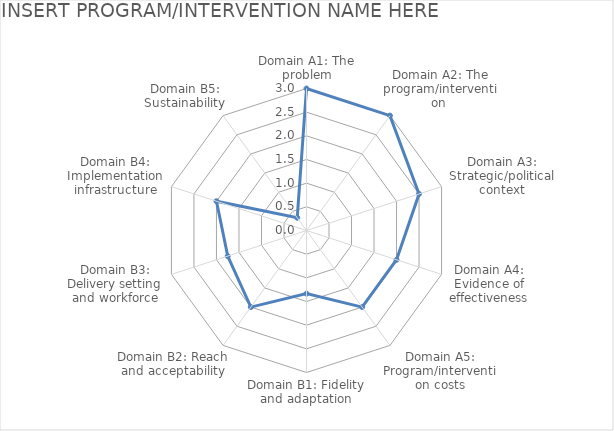
| Category | Score |
|---|---|
| Domain A1: The problem | 3 |
| Domain A2: The program/intervention  | 3 |
| Domain A3: Strategic/political context | 2.5 |
| Domain A4: Evidence of effectiveness | 2 |
| Domain A5: Program/intervention costs | 2 |
| Domain B1: Fidelity and adaptation | 1.333 |
| Domain B2: Reach and acceptability | 2 |
| Domain B3: Delivery setting and workforce | 1.75 |
| Domain B4: Implementation infrastructure | 2 |
| Domain B5: Sustainability | 0.333 |